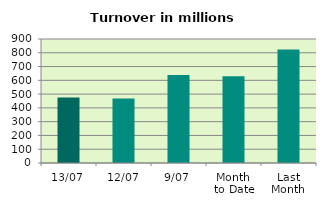
| Category | Series 0 |
|---|---|
| 13/07 | 474.921 |
| 12/07 | 468.696 |
| 9/07 | 639.368 |
| Month 
to Date | 629.596 |
| Last
Month | 824.124 |